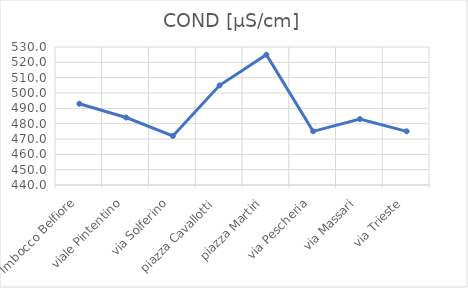
| Category | COND [µS/cm] |
|---|---|
| Imbocco Belfiore | 493 |
| viale Pintentino | 484 |
| via Solferino | 472 |
| piazza Cavallotti | 505 |
| piazza Martiri | 525 |
| via Pescheria | 475 |
| via Massari | 483 |
| via Trieste | 475 |